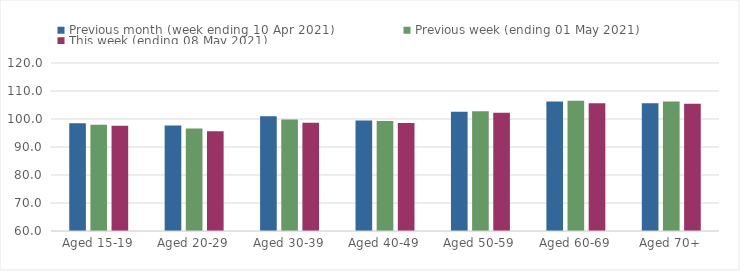
| Category | Previous month (week ending 10 Apr 2021) | Previous week (ending 01 May 2021) | This week (ending 08 May 2021) |
|---|---|---|---|
| Aged 15-19 | 98.52 | 97.99 | 97.62 |
| Aged 20-29 | 97.69 | 96.63 | 95.61 |
| Aged 30-39 | 100.99 | 99.8 | 98.67 |
| Aged 40-49 | 99.5 | 99.27 | 98.55 |
| Aged 50-59 | 102.57 | 102.74 | 102.26 |
| Aged 60-69 | 106.21 | 106.5 | 105.62 |
| Aged 70+ | 105.66 | 106.24 | 105.42 |